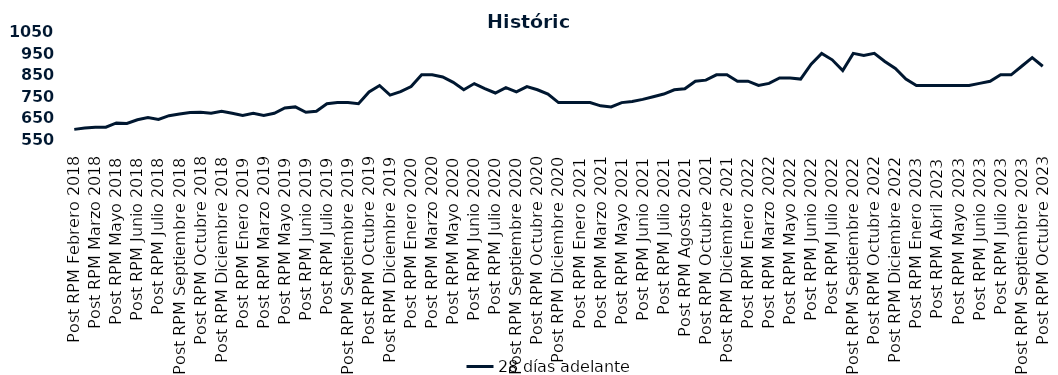
| Category | 28 días adelante |
|---|---|
| Post RPM Febrero 2018 | 595 |
| Pre RPM Marzo 2018 | 601 |
| Post RPM Marzo 2018 | 605 |
| Pre RPM Mayo 2018 | 605 |
| Post RPM Mayo 2018 | 625 |
| Pre RPM Junio 2018 | 623 |
| Post RPM Junio 2018 | 640 |
| Pre RPM Julio 2018 | 650 |
| Post RPM Julio 2018 | 641 |
| Pre RPM Septiembre 2018 | 659 |
| Post RPM Septiembre 2018 | 666.75 |
| Pre RPM Octubre 2018 | 674 |
| Post RPM Octubre 2018 | 675 |
| Pre RPM Diciembre 2018 | 670 |
| Post RPM Diciembre 2018 | 680 |
| Pre RPM Enero 2019 | 670 |
| Post RPM Enero 2019 | 660 |
| Pre RPM Marzo 2019 | 670 |
| Post RPM Marzo 2019 | 660 |
| Pre RPM Mayo 2019 | 670 |
| Post RPM Mayo 2019 | 695 |
| Pre RPM Junio 2019 | 700 |
| Post RPM Junio 2019 | 675 |
| Pre RPM Julio 2019 | 680 |
| Post RPM Julio 2019 | 715 |
| Pre RPM Septiembre 2019 | 720 |
| Post RPM Septiembre 2019 | 720 |
| Pre RPM Octubre 2019 | 715 |
| Post RPM Octubre 2019 | 770 |
| Pre RPM Diciembre 2019 | 800 |
| Post RPM Diciembre 2019 | 755 |
| Pre RPM Enero 2020 | 771 |
| Post RPM Enero 2020 | 795 |
| Pre RPM Marzo 2020 | 850 |
| Post RPM Marzo 2020 | 850 |
| Pre RPM Mayo 2020 | 840 |
| Post RPM Mayo 2020 | 815 |
| Pre RPM Junio 2020 | 780 |
| Post RPM Junio 2020 | 809 |
| Pre RPM Julio 2020 | 785.72 |
| Post RPM Julio 2020 | 765 |
| Pre RPM Septiembre 2020 | 790 |
| Post RPM Septiembre 2020 | 770 |
| Pre RPM Octubre 2020 | 795 |
| Post RPM Octubre 2020 | 780 |
| Pre RPM Diciembre 2020 | 760 |
| Post RPM Diciembre 2020 | 720 |
| Pre RPM Enero 2021 | 720 |
| Post RPM Enero 2021 | 720 |
| Pre RPM Marzo 2021 | 720 |
| Post RPM Marzo 2021 | 705 |
| Pre RPM Mayo 2021 | 700 |
| Post RPM Mayo 2021 | 720 |
| Pre RPM Junio 2021 | 725 |
| Post RPM Junio 2021 | 735 |
| Pre RPM Julio 2021 | 747.5 |
| Post RPM Julio 2021 | 760 |
| Pre RPM Agosto 2021 | 780 |
| Post RPM Agosto 2021 | 785 |
| Pre RPM Octubre 2021 | 820 |
| Post RPM Octubre 2021 | 825 |
| Pre RPM Diciembre 2021 | 850 |
| Post RPM Diciembre 2021 | 850 |
| Pre RPM Enero 2022 | 820 |
| Post RPM Enero 2022 | 820 |
| Pre RPM Marzo 2022 | 800 |
| Post RPM Marzo 2022 | 810 |
| Pre RPM Mayo 2022 | 835 |
| Post RPM Mayo 2022 | 835 |
| Pre RPM Junio 2022 | 830 |
| Post RPM Junio 2022 | 900 |
| Pre RPM Julio 2022 | 950 |
| Post RPM Julio 2022 | 920 |
| Pre RPM Septiembre 2022 | 870 |
| Post RPM Septiembre 2022 | 950 |
| Pre RPM Octubre 2022 | 940 |
| Post RPM Octubre 2022 | 950 |
| Pre RPM Diciembre 2022 | 912.5 |
| Post RPM Diciembre 2022 | 880 |
| Pre RPM Enero 2023 | 830 |
| Post RPM Enero 2023 | 800 |
| Pre RPM Abril 2023 | 800 |
| Post RPM Abril 2023 | 800 |
| Pre RPM Mayo 2023 | 800 |
| Post RPM Mayo 2023 | 800 |
| Pre RPM Junio 2023 | 800 |
| Post RPM Junio 2023 | 810 |
| Pre RPM Julio 2023 | 820 |
| Post RPM Julio 2023 | 850 |
| Pre RPM Septiembre 2023 | 850 |
| Post RPM Septiembre 2023 | 890 |
| Pre RPM Octubre 2023 | 930 |
| Post RPM Octubre 2023 | 890 |